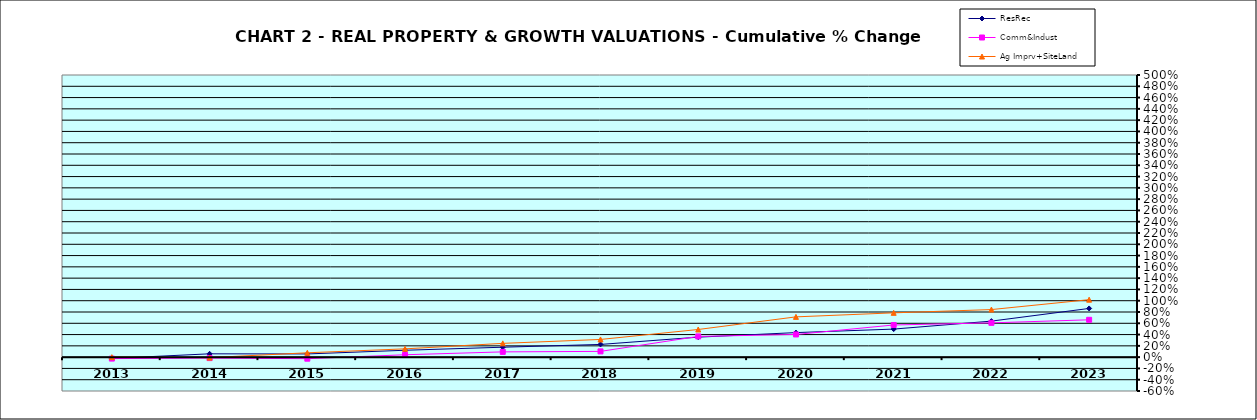
| Category | ResRec | Comm&Indust | Ag Imprv+SiteLand |
|---|---|---|---|
| 2013.0 | -0.023 | -0.025 | 0 |
| 2014.0 | 0.059 | -0.017 | -0.008 |
| 2015.0 | 0.057 | -0.027 | 0.077 |
| 2016.0 | 0.122 | 0.042 | 0.147 |
| 2017.0 | 0.176 | 0.093 | 0.244 |
| 2018.0 | 0.225 | 0.102 | 0.314 |
| 2019.0 | 0.354 | 0.367 | 0.49 |
| 2020.0 | 0.435 | 0.402 | 0.714 |
| 2021.0 | 0.497 | 0.57 | 0.785 |
| 2022.0 | 0.638 | 0.608 | 0.843 |
| 2023.0 | 0.863 | 0.662 | 1.019 |